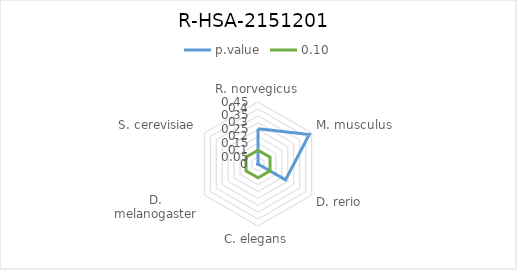
| Category | p.value | 0.10 |
|---|---|---|
| R. norvegicus | 0.256 | 0.1 |
| M. musculus | 0.43 | 0.1 |
| D. rerio | 0.23 | 0.1 |
| C. elegans | 0 | 0.1 |
| D. melanogaster | 0.012 | 0.1 |
| S. cerevisiae | 0 | 0.1 |